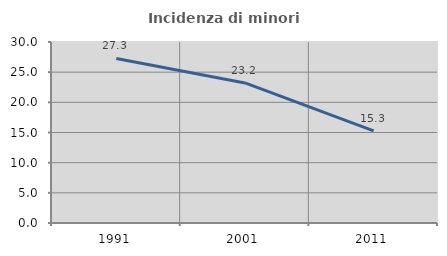
| Category | Incidenza di minori stranieri |
|---|---|
| 1991.0 | 27.273 |
| 2001.0 | 23.214 |
| 2011.0 | 15.267 |